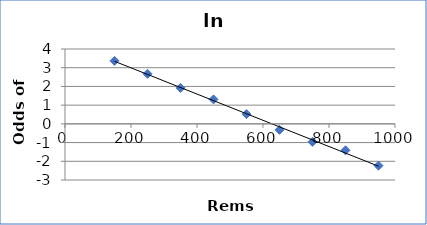
| Category | ln Odds(E) |
|---|---|
| 150.0 | 3.367 |
| 250.0 | 2.674 |
| 350.0 | 1.92 |
| 450.0 | 1.307 |
| 550.0 | 0.521 |
| 650.0 | -0.32 |
| 750.0 | -0.96 |
| 850.0 | -1.411 |
| 950.0 | -2.234 |